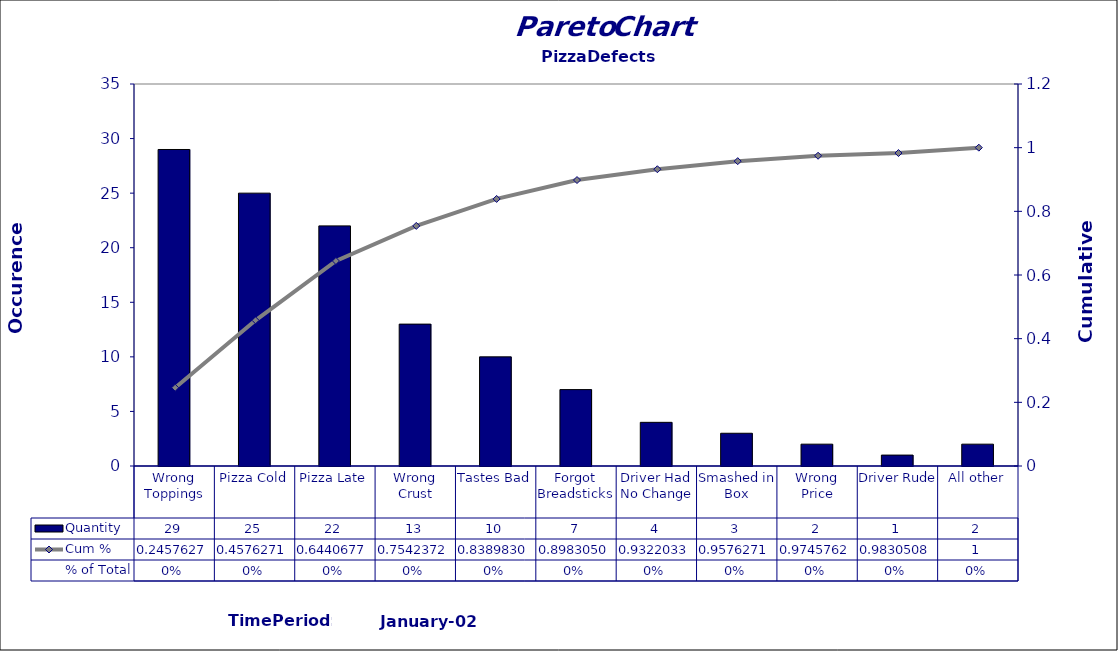
| Category | Quantity |
|---|---|
|  Wrong Toppings  | 29 |
|  Pizza Cold  | 25 |
|  Pizza Late  | 22 |
|  Wrong Crust  | 13 |
|  Tastes Bad  | 10 |
|  Forgot Breadsticks  | 7 |
|  Driver Had No Change  | 4 |
|  Smashed in Box  | 3 |
|  Wrong Price  | 2 |
|  Driver Rude  | 1 |
| All other | 2 |